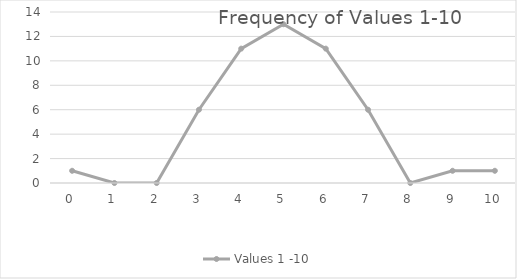
| Category | Values 1 -10 |
|---|---|
| 0.0 | 1 |
| 1.0 | 0 |
| 2.0 | 0 |
| 3.0 | 6 |
| 4.0 | 11 |
| 5.0 | 13 |
| 6.0 | 11 |
| 7.0 | 6 |
| 8.0 | 0 |
| 9.0 | 1 |
| 10.0 | 1 |